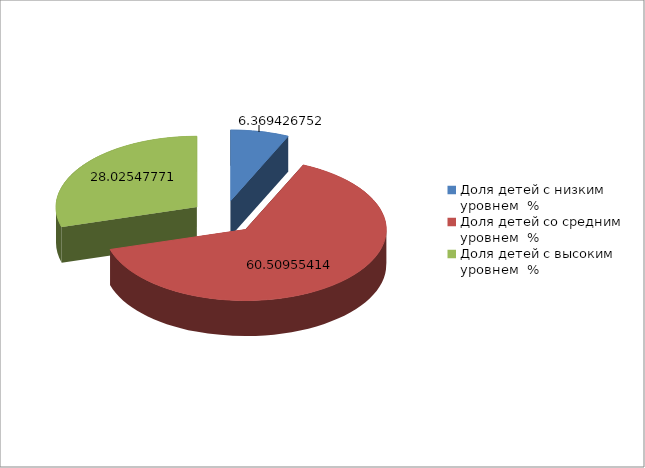
| Category | Series 0 |
|---|---|
| Доля детей с низким уровнем  % | 6.369 |
| Доля детей со средним уровнем  % | 60.51 |
| Доля детей с высоким уровнем  % | 28.025 |